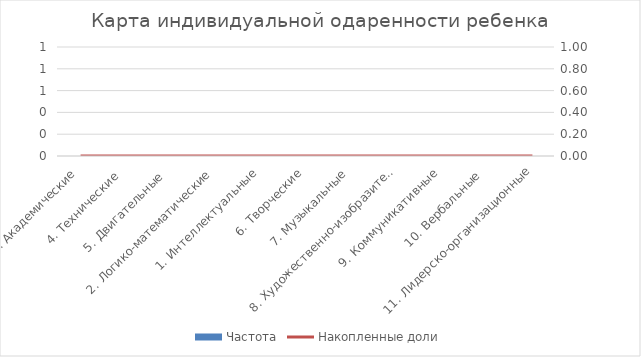
| Category | Частота |
|---|---|
| 3. Академические | 0 |
| 4. Технические  | 0 |
| 5. Двигательные  | 0 |
| 2. Логико-математические | 0 |
| 1. Интеллектуальные | 0 |
| 6. Творческие | 0 |
| 7. Музыкальные | 0 |
| 8. Художественно-изобразительные | 0 |
| 9. Коммуникативные | 0 |
| 10. Вербальные  | 0 |
| 11. Лидерско-организационные | 0 |